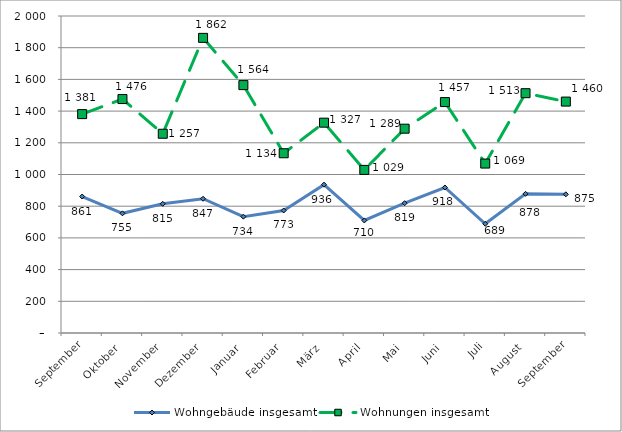
| Category | Wohngebäude insgesamt | Wohnungen insgesamt |
|---|---|---|
| September | 861 | 1381 |
| Oktober | 755 | 1476 |
| November | 815 | 1257 |
| Dezember | 847 | 1862 |
| Januar | 734 | 1564 |
| Februar | 773 | 1134 |
| März | 936 | 1327 |
| April | 710 | 1029 |
| Mai | 819 | 1289 |
| Juni | 918 | 1457 |
| Juli | 689 | 1069 |
| August | 878 | 1513 |
| September | 875 | 1460 |